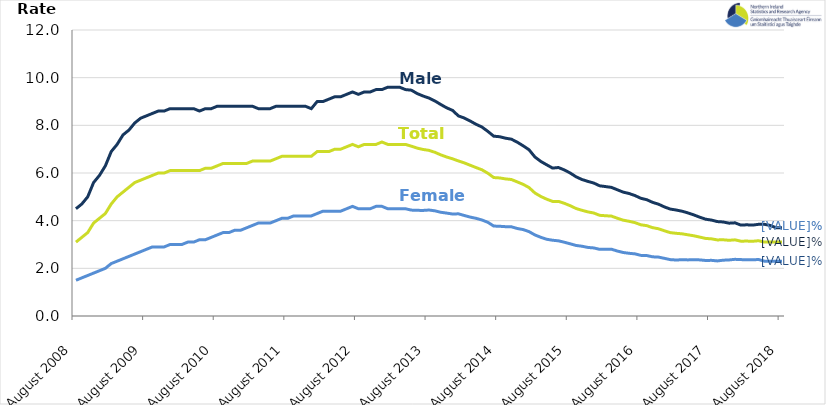
| Category | Male | Female | Total |
|---|---|---|---|
| 2008-08-01 | 4.5 | 1.5 | 3.1 |
| 2008-09-01 | 4.7 | 1.6 | 3.3 |
| 2008-10-01 | 5 | 1.7 | 3.5 |
| 2008-11-01 | 5.6 | 1.8 | 3.9 |
| 2008-12-01 | 5.9 | 1.9 | 4.1 |
| 2009-01-01 | 6.3 | 2 | 4.3 |
| 2009-02-01 | 6.9 | 2.2 | 4.7 |
| 2009-03-01 | 7.2 | 2.3 | 5 |
| 2009-04-01 | 7.6 | 2.4 | 5.2 |
| 2009-05-01 | 7.8 | 2.5 | 5.4 |
| 2009-06-01 | 8.1 | 2.6 | 5.6 |
| 2009-07-01 | 8.3 | 2.7 | 5.7 |
| 2009-08-01 | 8.4 | 2.8 | 5.8 |
| 2009-09-01 | 8.5 | 2.9 | 5.9 |
| 2009-10-01 | 8.6 | 2.9 | 6 |
| 2009-11-01 | 8.6 | 2.9 | 6 |
| 2009-12-01 | 8.7 | 3 | 6.1 |
| 2010-01-01 | 8.7 | 3 | 6.1 |
| 2010-02-01 | 8.7 | 3 | 6.1 |
| 2010-03-01 | 8.7 | 3.1 | 6.1 |
| 2010-04-01 | 8.7 | 3.1 | 6.1 |
| 2010-05-01 | 8.6 | 3.2 | 6.1 |
| 2010-06-01 | 8.7 | 3.2 | 6.2 |
| 2010-07-01 | 8.7 | 3.3 | 6.2 |
| 2010-08-01 | 8.8 | 3.4 | 6.3 |
| 2010-09-01 | 8.8 | 3.5 | 6.4 |
| 2010-10-01 | 8.8 | 3.5 | 6.4 |
| 2010-11-01 | 8.8 | 3.6 | 6.4 |
| 2010-12-01 | 8.8 | 3.6 | 6.4 |
| 2011-01-01 | 8.8 | 3.7 | 6.4 |
| 2011-02-01 | 8.8 | 3.8 | 6.5 |
| 2011-03-01 | 8.7 | 3.9 | 6.5 |
| 2011-04-01 | 8.7 | 3.9 | 6.5 |
| 2011-05-01 | 8.7 | 3.9 | 6.5 |
| 2011-06-01 | 8.8 | 4 | 6.6 |
| 2011-07-01 | 8.8 | 4.1 | 6.7 |
| 2011-08-01 | 8.8 | 4.1 | 6.7 |
| 2011-09-01 | 8.8 | 4.2 | 6.7 |
| 2011-10-01 | 8.8 | 4.2 | 6.7 |
| 2011-11-01 | 8.8 | 4.2 | 6.7 |
| 2011-12-01 | 8.7 | 4.2 | 6.7 |
| 2012-01-01 | 9 | 4.3 | 6.9 |
| 2012-02-01 | 9 | 4.4 | 6.9 |
| 2012-03-01 | 9.1 | 4.4 | 6.9 |
| 2012-04-01 | 9.2 | 4.4 | 7 |
| 2012-05-01 | 9.2 | 4.4 | 7 |
| 2012-06-01 | 9.3 | 4.5 | 7.1 |
| 2012-07-01 | 9.4 | 4.6 | 7.2 |
| 2012-08-01 | 9.3 | 4.5 | 7.1 |
| 2012-09-01 | 9.4 | 4.5 | 7.2 |
| 2012-10-01 | 9.4 | 4.5 | 7.2 |
| 2012-11-01 | 9.5 | 4.6 | 7.2 |
| 2012-12-01 | 9.5 | 4.6 | 7.3 |
| 2013-01-01 | 9.6 | 4.5 | 7.2 |
| 2013-02-01 | 9.6 | 4.5 | 7.2 |
| 2013-03-01 | 9.6 | 4.5 | 7.2 |
| 2013-04-01 | 9.5 | 4.5 | 7.2 |
| 2013-05-01 | 9.476 | 4.443 | 7.125 |
| 2013-06-01 | 9.332 | 4.433 | 7.043 |
| 2013-07-01 | 9.229 | 4.43 | 6.987 |
| 2013-08-01 | 9.146 | 4.446 | 6.95 |
| 2013-09-01 | 9.022 | 4.413 | 6.869 |
| 2013-10-01 | 8.874 | 4.352 | 6.761 |
| 2013-11-01 | 8.735 | 4.318 | 6.671 |
| 2013-12-01 | 8.627 | 4.278 | 6.595 |
| 2014-01-01 | 8.395 | 4.288 | 6.505 |
| 2014-02-01 | 8.306 | 4.217 | 6.424 |
| 2014-03-01 | 8.181 | 4.149 | 6.326 |
| 2014-04-01 | 8.043 | 4.098 | 6.228 |
| 2014-05-01 | 7.929 | 4.028 | 6.134 |
| 2014-06-01 | 7.745 | 3.931 | 5.99 |
| 2014-07-01 | 7.545 | 3.774 | 5.81 |
| 2014-08-01 | 7.522 | 3.765 | 5.793 |
| 2014-09-01 | 7.461 | 3.748 | 5.752 |
| 2014-10-01 | 7.419 | 3.743 | 5.727 |
| 2014-11-01 | 7.293 | 3.672 | 5.627 |
| 2014-12-01 | 7.141 | 3.626 | 5.523 |
| 2015-01-01 | 6.975 | 3.54 | 5.389 |
| 2015-02-01 | 6.672 | 3.401 | 5.162 |
| 2015-03-01 | 6.485 | 3.302 | 5.016 |
| 2015-04-01 | 6.344 | 3.219 | 4.901 |
| 2015-05-01 | 6.207 | 3.179 | 4.809 |
| 2015-06-01 | 6.229 | 3.154 | 4.809 |
| 2015-07-01 | 6.128 | 3.095 | 4.728 |
| 2015-08-01 | 5.999 | 3.028 | 4.627 |
| 2015-09-01 | 5.839 | 2.959 | 4.509 |
| 2015-10-01 | 5.727 | 2.927 | 4.434 |
| 2015-11-01 | 5.648 | 2.877 | 4.368 |
| 2015-12-01 | 5.578 | 2.856 | 4.321 |
| 2016-01-01 | 5.463 | 2.797 | 4.225 |
| 2016-02-01 | 5.431 | 2.796 | 4.207 |
| 2016-03-01 | 5.396 | 2.802 | 4.191 |
| 2016-04-01 | 5.297 | 2.726 | 4.103 |
| 2016-05-01 | 5.198 | 2.665 | 4.021 |
| 2016-06-01 | 5.14 | 2.631 | 3.974 |
| 2016-07-01 | 5.054 | 2.608 | 3.918 |
| 2016-08-01 | 4.939 | 2.544 | 3.827 |
| 2016-09-01 | 4.88 | 2.537 | 3.791 |
| 2016-10-01 | 4.768 | 2.483 | 3.707 |
| 2016-11-01 | 4.692 | 2.471 | 3.661 |
| 2016-12-01 | 4.577 | 2.42 | 3.575 |
| 2017-01-01 | 4.487 | 2.365 | 3.498 |
| 2017-02-01 | 4.447 | 2.349 | 3.469 |
| 2017-03-01 | 4.397 | 2.362 | 3.448 |
| 2017-04-01 | 4.326 | 2.354 | 3.407 |
| 2017-05-01 | 4.241 | 2.364 | 3.366 |
| 2017-06-01 | 4.147 | 2.354 | 3.311 |
| 2017-07-01 | 4.062 | 2.33 | 3.255 |
| 2017-08-01 | 4.025 | 2.335 | 3.237 |
| 2017-09-01 | 3.962 | 2.311 | 3.192 |
| 2017-10-01 | 3.945 | 2.341 | 3.198 |
| 2017-11-01 | 3.895 | 2.353 | 3.176 |
| 2017-12-01 | 3.909 | 2.378 | 3.196 |
| 2018-01-01 | 3.814 | 2.366 | 3.139 |
| 2018-02-01 | 3.826 | 2.361 | 3.143 |
| 2018-03-01 | 3.814 | 2.357 | 3.135 |
| 2018-04-01 | 3.846 | 2.371 | 3.159 |
| 2018-05-01 | 3.846 | 2.3 | 3.1 |
| 2018-06-01 | 3.8 | 2.3 | 3.1 |
| 2018-07-01 | 3.7 | 2.3 | 3.1 |
| 2018-08-01 | 3.7 | 2.3 | 3.1 |